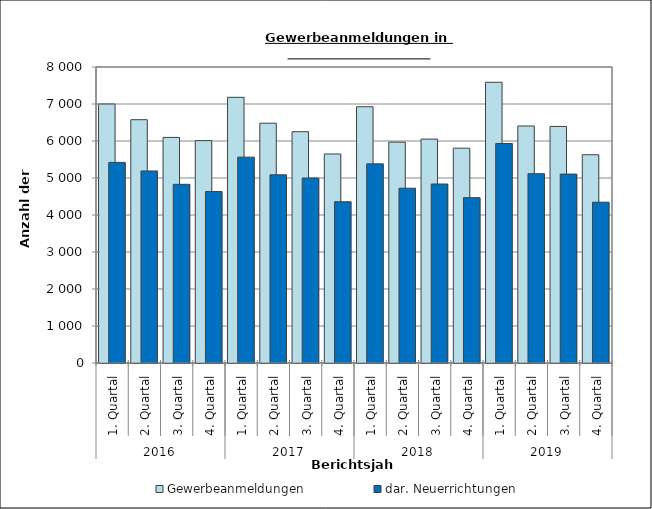
| Category | Gewerbeanmeldungen | dar. Neuerrichtungen |
|---|---|---|
| 0 | 7000 | 5421 |
| 1 | 6576 | 5191 |
| 2 | 6097 | 4829 |
| 3 | 6010 | 4634 |
| 4 | 7180 | 5564 |
| 5 | 6481 | 5086 |
| 6 | 6251 | 5000 |
| 7 | 5649 | 4358 |
| 8 | 6926 | 5382 |
| 9 | 5969 | 4724 |
| 10 | 6051 | 4838 |
| 11 | 5806 | 4469 |
| 12 | 7587 | 5933 |
| 13 | 6406 | 5116 |
| 14 | 6393 | 5106 |
| 15 | 5629 | 4346 |